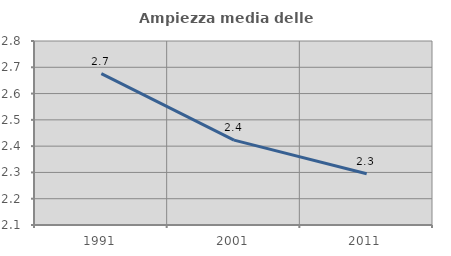
| Category | Ampiezza media delle famiglie |
|---|---|
| 1991.0 | 2.676 |
| 2001.0 | 2.423 |
| 2011.0 | 2.295 |